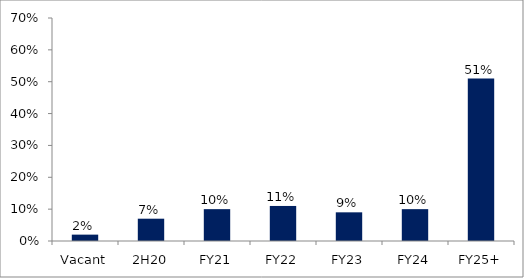
| Category | Series 0 |
|---|---|
| Vacant | 0.02 |
| 2H20 | 0.07 |
| FY21 | 0.1 |
| FY22 | 0.11 |
| FY23 | 0.09 |
| FY24 | 0.1 |
| FY25+ | 0.51 |